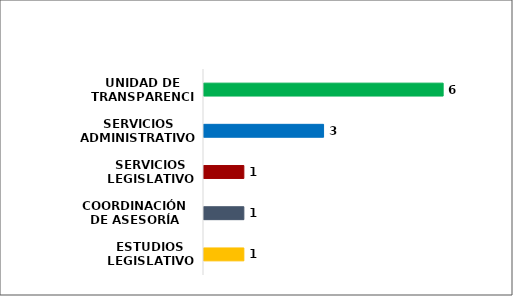
| Category | Series 0 |
|---|---|
| ESTUDIOS LEGISLATIVOS | 1 |
| COORDINACIÓN DE ASESORÍA | 1 |
| SERVICIOS LEGISLATIVOS | 1 |
| SERVICIOS ADMINISTRATIVOS | 3 |
| UNIDAD DE TRANSPARENCIA | 6 |